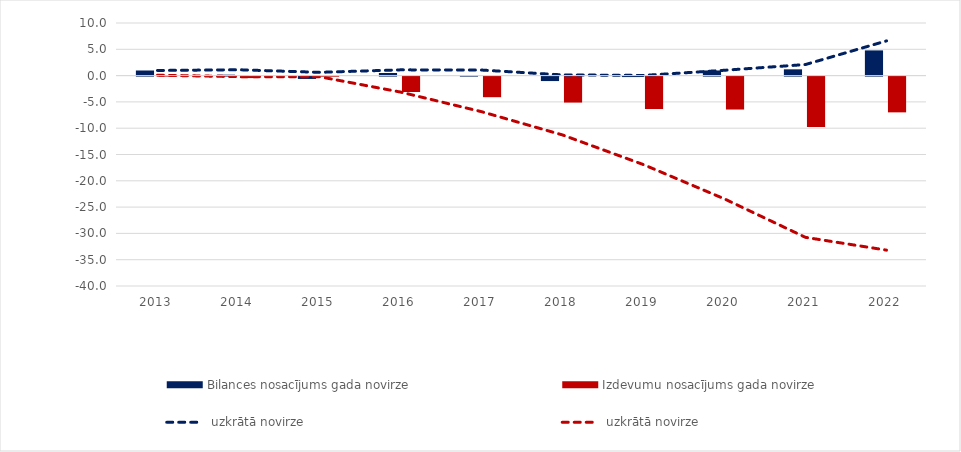
| Category | Bilances nosacījums | Izdevumu nosacījums |
|---|---|---|
| 2013.0 | 0.972 | 0.081 |
| 2014.0 | 0.176 | -0.282 |
| 2015.0 | -0.447 | -0.018 |
| 2016.0 | 0.49 | -2.923 |
| 2017.0 | 0.029 | -3.914 |
| 2018.0 | -0.848 | -4.935 |
| 2019.0 | -0.089 | -6.166 |
| 2020.0 | 0.977 | -6.261 |
| 2021.0 | 1.191 | -9.583 |
| 2022.0 | 4.791 | -6.799 |